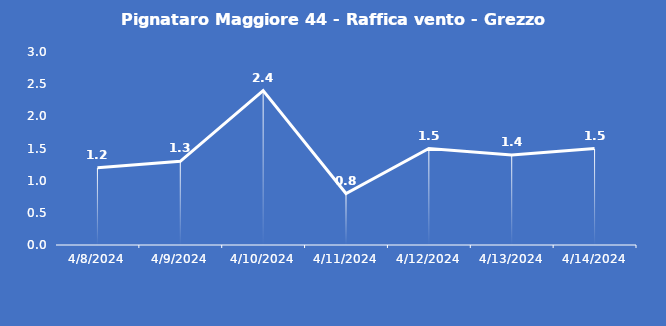
| Category | Pignataro Maggiore 44 - Raffica vento - Grezzo (m/s) |
|---|---|
| 4/8/24 | 1.2 |
| 4/9/24 | 1.3 |
| 4/10/24 | 2.4 |
| 4/11/24 | 0.8 |
| 4/12/24 | 1.5 |
| 4/13/24 | 1.4 |
| 4/14/24 | 1.5 |